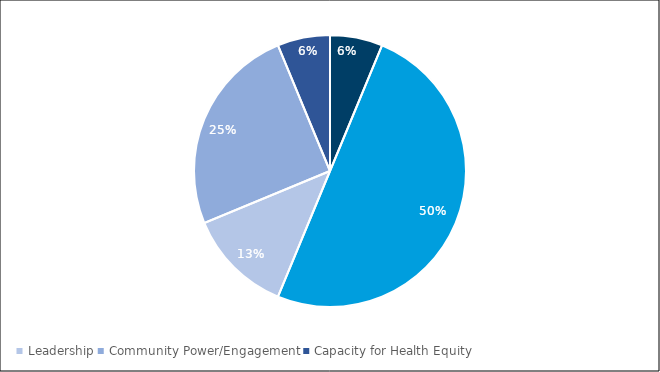
| Category | Votes for "What Focus Area stood out as most important?" |
|---|---|
| Resources | 1 |
| Workforce | 8 |
| Leadership | 2 |
| Community Power/Engagement | 4 |
| Capacity for Health Equity | 1 |